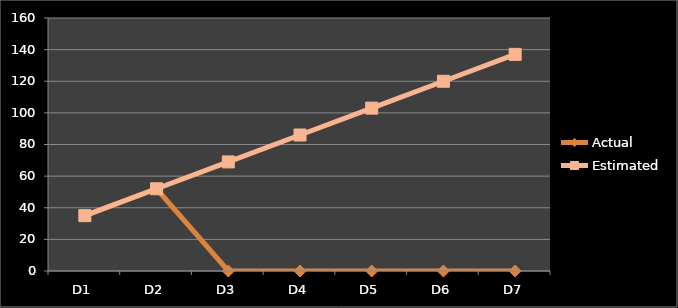
| Category | Actual | Estimated |
|---|---|---|
| D1 | 35 | 35 |
| D2 | 52 | 52 |
| D3 | 0 | 69 |
| D4 | 0 | 86 |
| D5 | 0 | 103 |
| D6 | 0 | 120 |
| D7 | 0 | 137 |